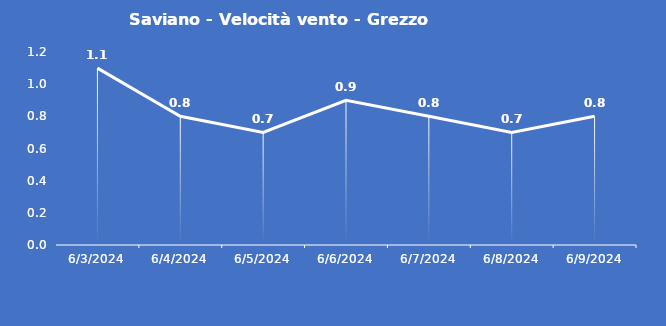
| Category | Saviano - Velocità vento - Grezzo (m/s) |
|---|---|
| 6/3/24 | 1.1 |
| 6/4/24 | 0.8 |
| 6/5/24 | 0.7 |
| 6/6/24 | 0.9 |
| 6/7/24 | 0.8 |
| 6/8/24 | 0.7 |
| 6/9/24 | 0.8 |